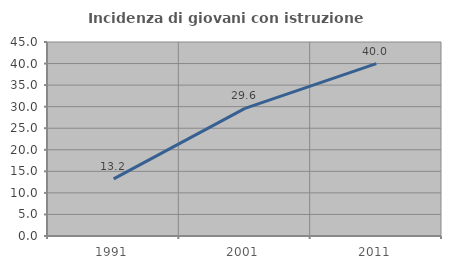
| Category | Incidenza di giovani con istruzione universitaria |
|---|---|
| 1991.0 | 13.235 |
| 2001.0 | 29.603 |
| 2011.0 | 40 |